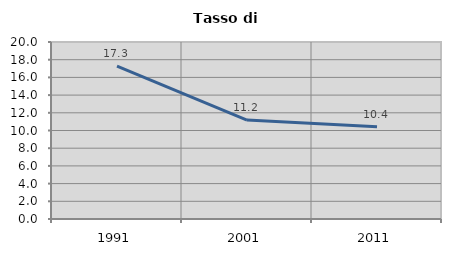
| Category | Tasso di disoccupazione   |
|---|---|
| 1991.0 | 17.269 |
| 2001.0 | 11.182 |
| 2011.0 | 10.415 |